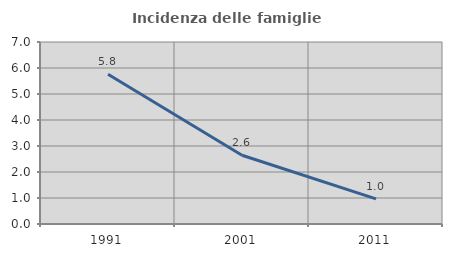
| Category | Incidenza delle famiglie numerose |
|---|---|
| 1991.0 | 5.758 |
| 2001.0 | 2.645 |
| 2011.0 | 0.964 |